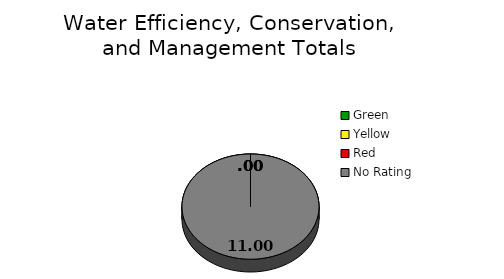
| Category | Series 0 |
|---|---|
| Green | 0 |
| Yellow | 0 |
| Red | 0 |
| No Rating | 11 |